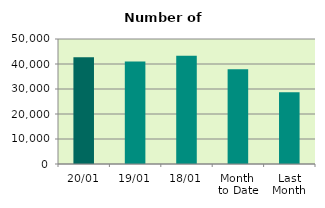
| Category | Series 0 |
|---|---|
| 20/01 | 42726 |
| 19/01 | 40972 |
| 18/01 | 43326 |
| Month 
to Date | 37907.714 |
| Last
Month | 28724.435 |